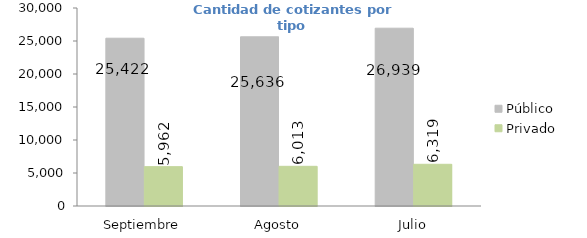
| Category | Público 
 | Privado |
|---|---|---|
| Septiembre | 25422 | 5962 |
| Agosto | 25636 | 6013 |
| Julio | 26939 | 6319 |